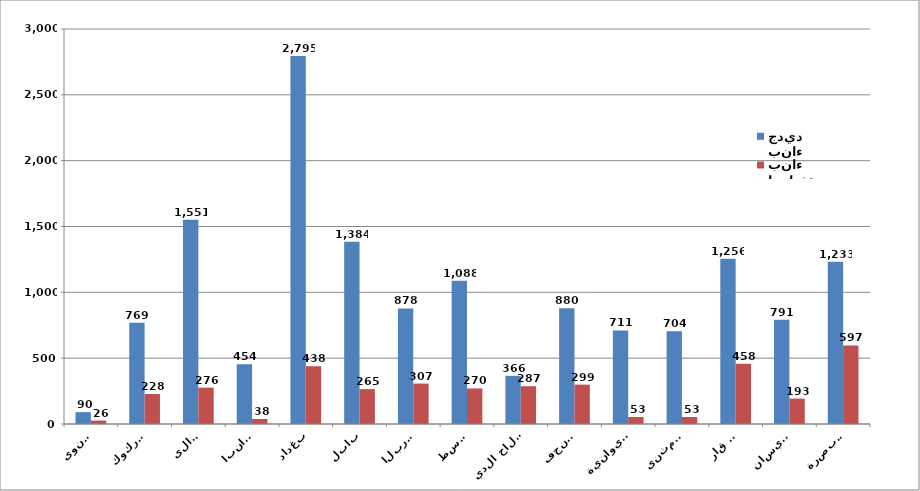
| Category | بناء جديد | اضافة بناء  |
|---|---|---|
| نينوى | 90 | 26 |
| كركوك | 769 | 228 |
| ديالى | 1551 | 276 |
| الانبار | 454 | 38 |
| بغداد | 2795 | 438 |
| بابل | 1384 | 265 |
| كربلاء | 878 | 307 |
| واسط | 1088 | 270 |
| صلاح الدين | 366 | 287 |
| النجف | 880 | 299 |
| الديوانية | 711 | 53 |
| المثنى  | 704 | 53 |
| ذي قار | 1256 | 458 |
| ميسان  | 791 | 193 |
| البصرة | 1233 | 597 |